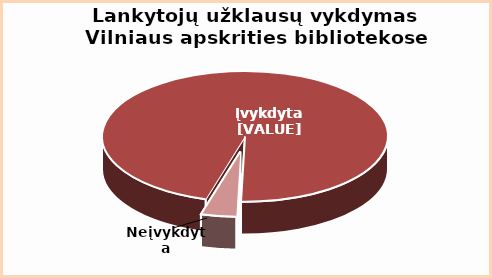
| Category | Series 0 |
|---|---|
| Įvykdyta | 0.96 |
| Neįvykdyta | 0.04 |